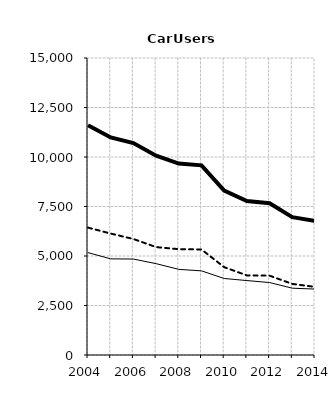
| Category | Built-up | Non built-up | Total |
|---|---|---|---|
| 2004.0 | 5171 | 6434 | 11605 |
| 2005.0 | 4856 | 6133 | 10989 |
| 2006.0 | 4846 | 5859 | 10705 |
| 2007.0 | 4614 | 5449 | 10063 |
| 2008.0 | 4325 | 5345 | 9670 |
| 2009.0 | 4249 | 5330 | 9579 |
| 2010.0 | 3865 | 4436 | 8301 |
| 2011.0 | 3759 | 4021 | 7780 |
| 2012.0 | 3660 | 4006 | 7666 |
| 2013.0 | 3374 | 3590 | 6964 |
| 2014.0 | 3330 | 3440 | 6770 |